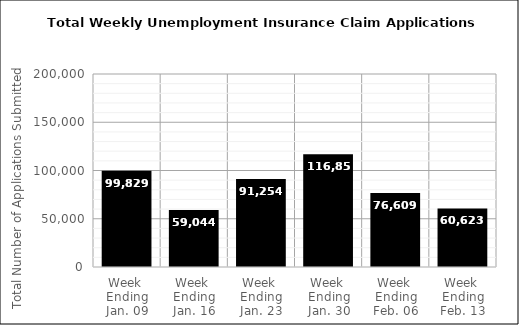
| Category | Series 0 |
|---|---|
| Week 
Ending
Jan. 09 | 99829 |
| Week 
Ending
Jan. 16 | 59044 |
| Week 
Ending
Jan. 23 | 91254 |
| Week 
Ending
Jan. 30 | 116854 |
| Week 
Ending
Feb. 06 | 76609 |
| Week 
Ending
Feb. 13 | 60623 |